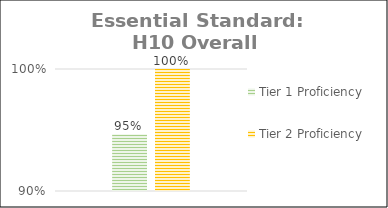
| Category | Tier 1 Proficiency | Tier 2 Proficiency |
|---|---|---|
| 0 | 0.946 | 1 |